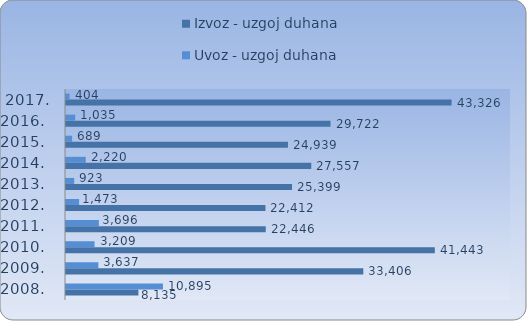
| Category | Izvoz - uzgoj duhana | Uvoz - uzgoj duhana |
|---|---|---|
| 2008.  | 8135.055 | 10894.822 |
| 2009.  | 33405.765 | 3636.873 |
| 2010.  | 41443.15 | 3209.398 |
| 2011.  | 22445.596 | 3695.844 |
| 2012.  | 22411.568 | 1472.885 |
| 2013.  | 25399.097 | 923.004 |
| 2014.  | 27557.168 | 2219.763 |
| 2015.  | 24938.874 | 689.26 |
| 2016.  | 29721.975 | 1035.008 |
| 2017. | 43325.641 | 403.634 |